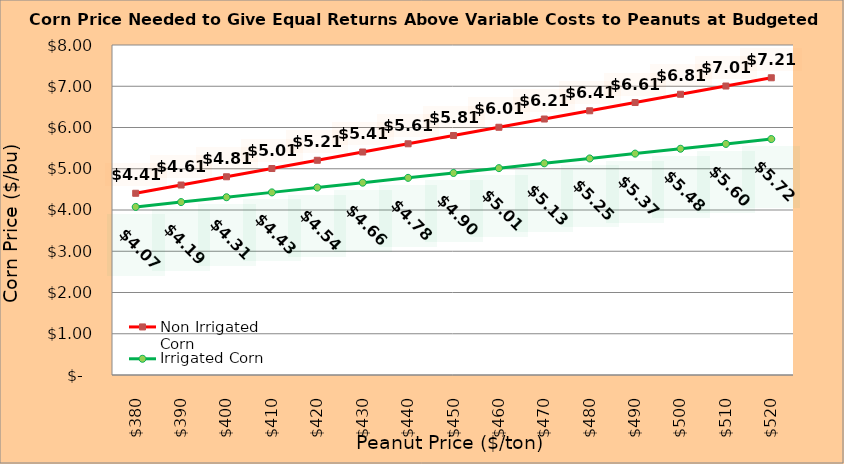
| Category | Non Irrigated Corn | Irrigated Corn |
|---|---|---|
| 380.0 | 4.405 | 4.075 |
| 390.0 | 4.605 | 4.192 |
| 400.0 | 4.805 | 4.31 |
| 410.0 | 5.005 | 4.427 |
| 420.0 | 5.205 | 4.545 |
| 430.0 | 5.405 | 4.662 |
| 440.0 | 5.605 | 4.78 |
| 450.0 | 5.805 | 4.897 |
| 460.0 | 6.005 | 5.015 |
| 470.0 | 6.205 | 5.132 |
| 480.0 | 6.405 | 5.25 |
| 490.0 | 6.605 | 5.367 |
| 500.0 | 6.805 | 5.485 |
| 510.0 | 7.005 | 5.602 |
| 520.0 | 7.205 | 5.72 |